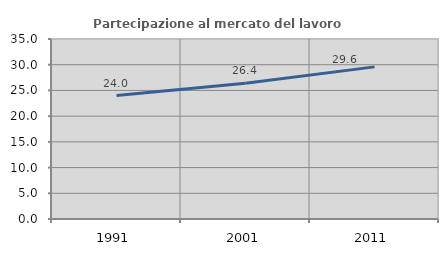
| Category | Partecipazione al mercato del lavoro  femminile |
|---|---|
| 1991.0 | 24.007 |
| 2001.0 | 26.397 |
| 2011.0 | 29.581 |